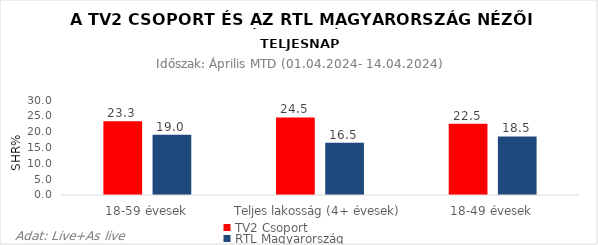
| Category | TV2 Csoport | RTL Magyarország |
|---|---|---|
| 18-59 évesek | 23.3 | 19 |
| Teljes lakosság (4+ évesek) | 24.5 | 16.5 |
| 18-49 évesek | 22.5 | 18.5 |